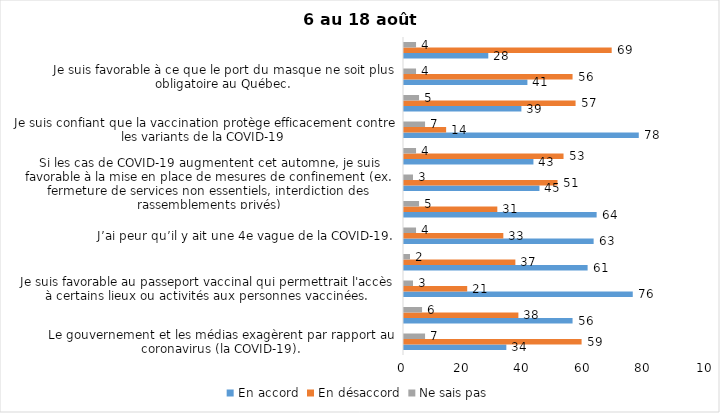
| Category | En accord | En désaccord | Ne sais pas |
|---|---|---|---|
| Le gouvernement et les médias exagèrent par rapport au coronavirus (la COVID-19). | 34 | 59 | 7 |
| J’ai peur que le système de santé soit débordé par les cas de COVID-19 suite au "déconfinement" | 56 | 38 | 6 |
| Je suis favorable au passeport vaccinal qui permettrait l'accès à certains lieux ou activités aux personnes vaccinées. | 76 | 21 | 3 |
| Malgré la levée des mesures de confinement, je préfère limiter mes contacts avec d’autres personnes (par ex., en évitant les activités sociales et de groupes) | 61 | 37 | 2 |
| J’ai peur qu’il y ait une 4e vague de la COVID-19. | 63 | 33 | 4 |
| Dans les régions en zone verte, le risque d’attraper la COVID-19 est minime. | 64 | 31 | 5 |
| Si les cas de COVID-19 augmentent cet automne, je suis favorable à la mise en place de mesures de confinement (ex. fermeture de services non essentiels, interdiction des rassemblements privés) | 45 | 51 | 3 |
| Je suis inquiet de contracter le variant Delta de la Covid-19 | 43 | 53 | 4 |
| Je suis confiant que la vaccination protège efficacement contre les variants de la COVID-19 | 78 | 14 | 7 |
| En raison de la baisse des cas de COID-19 je pense que le gouvernement du Québec devrait mettre fin à l’état d’urgence sanitaire | 39 | 57 | 5 |
| Je suis favorable à ce que le port du masque ne soit plus obligatoire au Québec. | 41 | 56 | 4 |
| Étant donné la progression de la vaccination, je pense qu’il est moins important de suivre les mesures de prévention. | 28 | 69 | 4 |